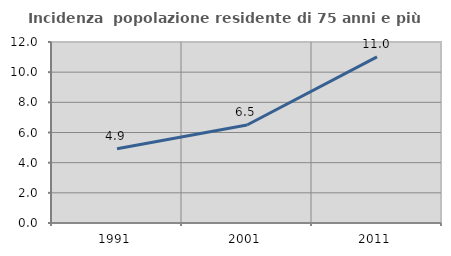
| Category | Incidenza  popolazione residente di 75 anni e più |
|---|---|
| 1991.0 | 4.919 |
| 2001.0 | 6.497 |
| 2011.0 | 11.011 |